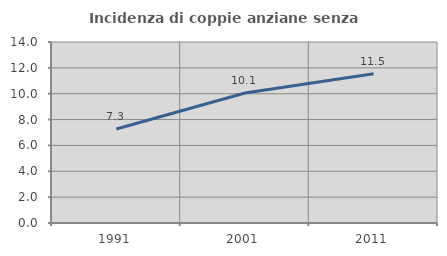
| Category | Incidenza di coppie anziane senza figli  |
|---|---|
| 1991.0 | 7.268 |
| 2001.0 | 10.053 |
| 2011.0 | 11.538 |